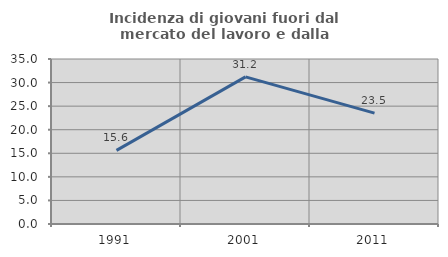
| Category | Incidenza di giovani fuori dal mercato del lavoro e dalla formazione  |
|---|---|
| 1991.0 | 15.619 |
| 2001.0 | 31.207 |
| 2011.0 | 23.529 |